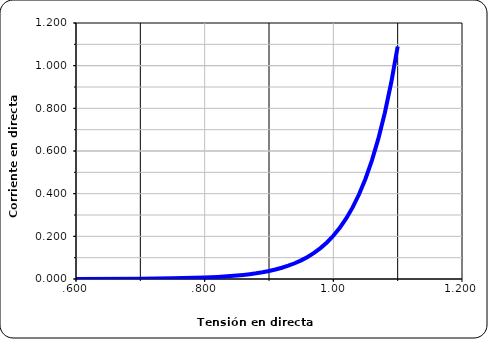
| Category | Series 0 |
|---|---|
| 0.6 | 0 |
| 0.7 | 0.001 |
| 0.75 | 0.003 |
| 0.8 | 0.007 |
| 0.81 | 0.008 |
| 0.82 | 0.01 |
| 0.83 | 0.012 |
| 0.84 | 0.014 |
| 0.85 | 0.016 |
| 0.86 | 0.019 |
| 0.87 | 0.023 |
| 0.88 | 0.027 |
| 0.89 | 0.032 |
| 0.9 | 0.038 |
| 0.91 | 0.045 |
| 0.92 | 0.053 |
| 0.93 | 0.062 |
| 0.94 | 0.074 |
| 0.95 | 0.087 |
| 0.96 | 0.103 |
| 0.97 | 0.122 |
| 0.98 | 0.145 |
| 0.99 | 0.171 |
| 1.0 | 0.203 |
| 1.01 | 0.24 |
| 1.02 | 0.284 |
| 1.03 | 0.336 |
| 1.04 | 0.397 |
| 1.05 | 0.47 |
| 1.06 | 0.556 |
| 1.07 | 0.658 |
| 1.08 | 0.778 |
| 1.09 | 0.921 |
| 1.1 | 1.09 |